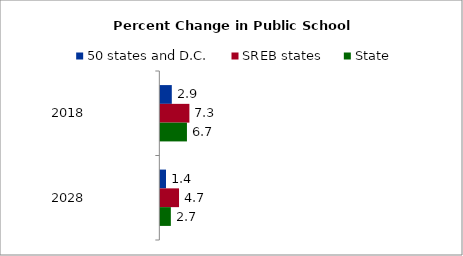
| Category | 50 states and D.C. | SREB states | State |
|---|---|---|---|
| 2018.0 | 2.9 | 7.347 | 6.729 |
| 2028.0 | 1.43 | 4.727 | 2.659 |